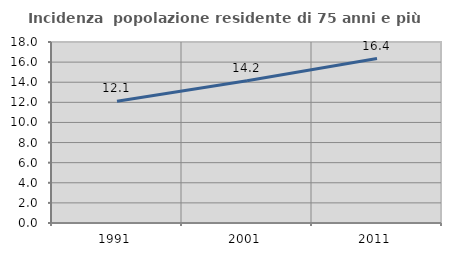
| Category | Incidenza  popolazione residente di 75 anni e più |
|---|---|
| 1991.0 | 12.115 |
| 2001.0 | 14.153 |
| 2011.0 | 16.351 |